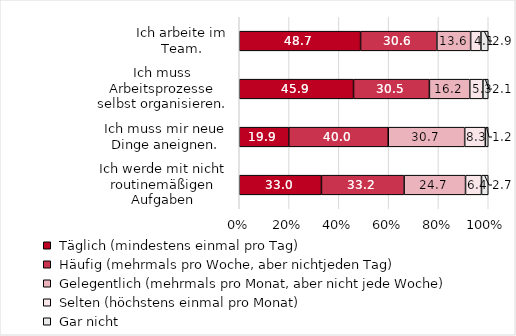
| Category | Series 0 | Series 1 | Series 2 | Series 3 | Series 4 |
|---|---|---|---|---|---|
| Ich werde mit nicht routinemäßigen Aufgaben konfrontiert. | 33.01 | 33.204 | 24.66 | 6.408 | 2.718 |
| Ich muss mir neue Dinge aneignen. | 19.884 | 39.961 | 30.695 | 8.301 | 1.158 |
| Ich muss Arbeitsprozesse selbst organisieren. | 45.898 | 30.469 | 16.211 | 5.273 | 2.148 |
| Ich arbeite im Team. | 48.723 | 30.648 | 13.556 | 4.126 | 2.947 |